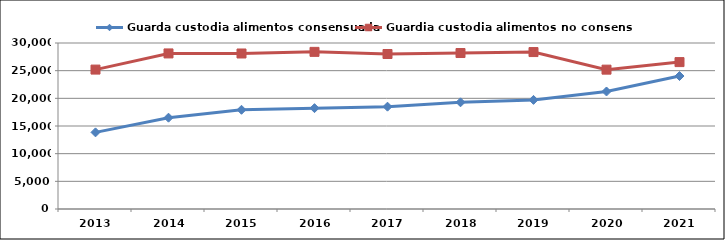
| Category | Guarda custodia alimentos consensuada | Guardia custodia alimentos no consensuada |
|---|---|---|
| 2013.0 | 13849 | 25194 |
| 2014.0 | 16502 | 28114 |
| 2015.0 | 17932 | 28104 |
| 2016.0 | 18225 | 28398 |
| 2017.0 | 18492 | 28011 |
| 2018.0 | 19281 | 28188 |
| 2019.0 | 19716 | 28364 |
| 2020.0 | 21236 | 25184 |
| 2021.0 | 24032 | 26548 |